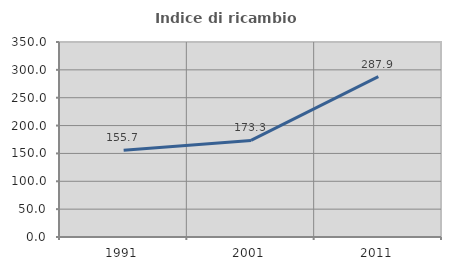
| Category | Indice di ricambio occupazionale  |
|---|---|
| 1991.0 | 155.696 |
| 2001.0 | 173.333 |
| 2011.0 | 287.931 |